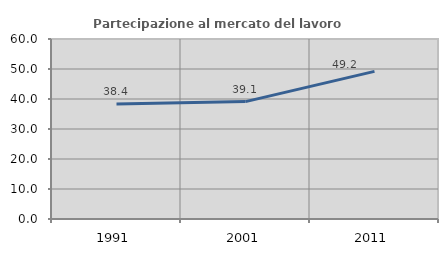
| Category | Partecipazione al mercato del lavoro  femminile |
|---|---|
| 1991.0 | 38.372 |
| 2001.0 | 39.13 |
| 2011.0 | 49.206 |